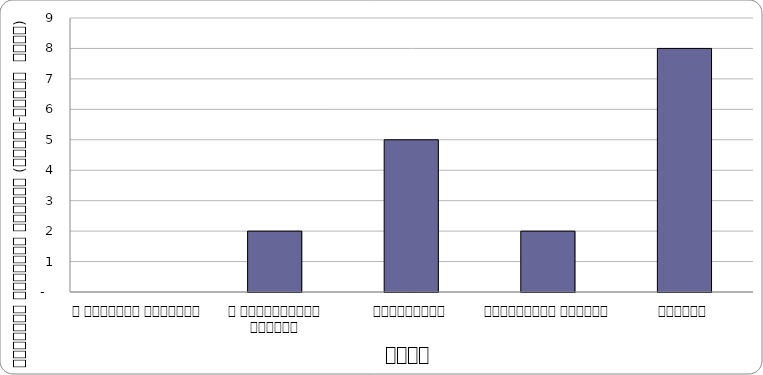
| Category | शासन |
|---|---|
| द हिमालयन टाइम्स् | 0 |
| द काठमाण्डौं पोस्ट् | 2 |
| कान्तिपुर | 5 |
| अन्नपूर्ण पोस्ट् | 2 |
| नागरिक | 8 |